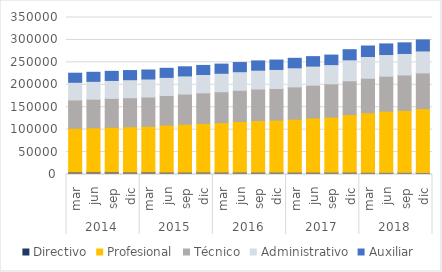
| Category | Directivo | Profesional | Técnico | Administrativo | Auxiliar |
|---|---|---|---|---|---|
| 0 | 5369 | 97683 | 63218 | 39315 | 20218 |
| 1 | 5458 | 98629 | 63738 | 39843 | 20201 |
| 2 | 5474 | 99810 | 64429 | 39931 | 20321 |
| 3 | 5218 | 101116 | 64799 | 40154 | 20430 |
| 4 | 5393 | 102080 | 65219 | 40230 | 20072 |
| 5 | 5080 | 104944 | 66100 | 40383 | 20229 |
| 6 | 5043 | 106972 | 67274 | 40488 | 20337 |
| 7 | 5122 | 108827 | 68032 | 40955 | 20236 |
| 8 | 5070 | 110525 | 68886 | 41176 | 20428 |
| 9 | 5048 | 113221 | 69494 | 41375 | 20457 |
| 10 | 5016 | 115161 | 70421 | 41907 | 20754 |
| 11 | 5000 | 116455 | 70255 | 42439 | 21006 |
| 12 | 4963 | 118348 | 71964 | 42632 | 21099 |
| 13 | 4965 | 121005 | 73184 | 42453 | 21146 |
| 14 | 4914 | 122992 | 74278 | 42762 | 21277 |
| 15 | 4940 | 128571 | 75383 | 46739 | 22621 |
| 16 | 4700 | 132817 | 77014 | 48483 | 23467 |
| 17 | 4635 | 136554 | 77999 | 48253 | 23691 |
| 18 | 4655 | 138199 | 78998 | 47965 | 23714 |
| 19 | 4628 | 142184 | 79709 | 48903 | 24568 |